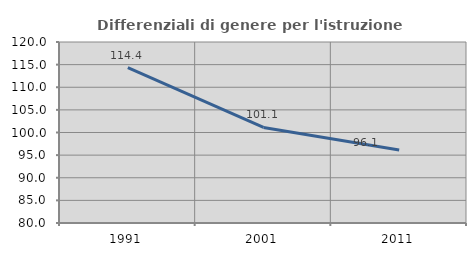
| Category | Differenziali di genere per l'istruzione superiore |
|---|---|
| 1991.0 | 114.351 |
| 2001.0 | 101.126 |
| 2011.0 | 96.134 |